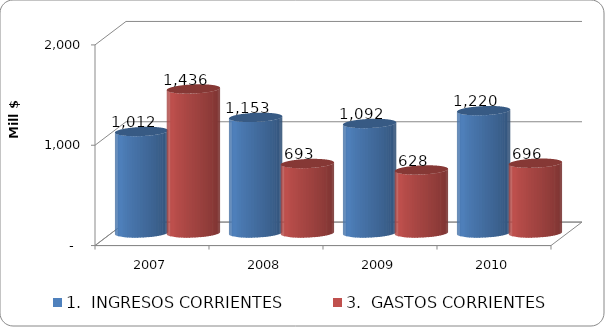
| Category | 1.  INGRESOS CORRIENTES | 3.  GASTOS CORRIENTES |
|---|---|---|
| 2007 | 1011.708 | 1435.869 |
| 2008 | 1152.68 | 692.611 |
| 2009 | 1091.94 | 628.378 |
| 2010 | 1219.606 | 695.841 |